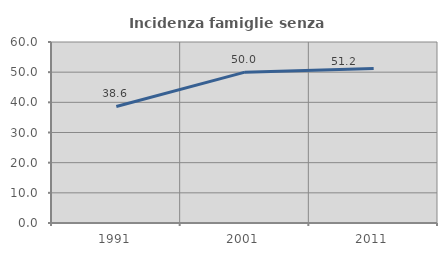
| Category | Incidenza famiglie senza nuclei |
|---|---|
| 1991.0 | 38.636 |
| 2001.0 | 50 |
| 2011.0 | 51.22 |